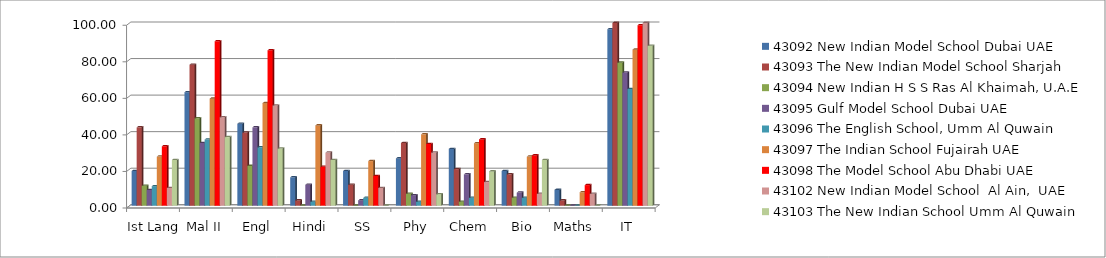
| Category | 43092 New Indian Model School Dubai UAE | 43093 The New Indian Model School Sharjah | 43094 New Indian H S S Ras Al Khaimah, U.A.E | 43095 Gulf Model School Dubai UAE | 43096 The English School, Umm Al Quwain | 43097 The Indian School Fujairah UAE | 43098 The Model School Abu Dhabi UAE | 43102 New Indian Model School  Al Ain,  UAE | 43103 The New Indian School Umm Al Quwain  |
|---|---|---|---|---|---|---|---|---|---|
| Ist Lang | 18.97 | 42.86 | 10.87 | 8.57 | 10.64 | 26.83 | 32.5 | 9.68 | 25 |
| Mal II | 62.07 | 77.14 | 47.83 | 34.29 | 36.17 | 58.54 | 90 | 48.39 | 37.5 |
| Engl | 44.83 | 40 | 21.74 | 42.86 | 31.91 | 56.1 | 85 | 54.84 | 31.25 |
| Hindi | 15.52 | 2.86 | 0 | 11.43 | 2.13 | 43.9 | 21.25 | 29.03 | 25 |
| SS | 18.97 | 11.43 | 0 | 2.86 | 4.26 | 24.39 | 16.25 | 9.68 | 0 |
| Phy | 25.86 | 34.29 | 6.52 | 5.71 | 2.13 | 39.02 | 33.75 | 29.03 | 6.25 |
| Chem | 31.03 | 20 | 2.17 | 17.14 | 4.26 | 34.15 | 36.25 | 12.9 | 18.75 |
| Bio | 18.97 | 17.14 | 4.35 | 7.14 | 4.26 | 26.83 | 27.5 | 6.45 | 25 |
| Maths | 8.62 | 2.86 | 0 | 0 | 0 | 7.32 | 11.25 | 6.45 | 0 |
| IT | 96.55 | 100 | 78.26 | 72.86 | 63.83 | 85.37 | 98.75 | 100 | 87.5 |